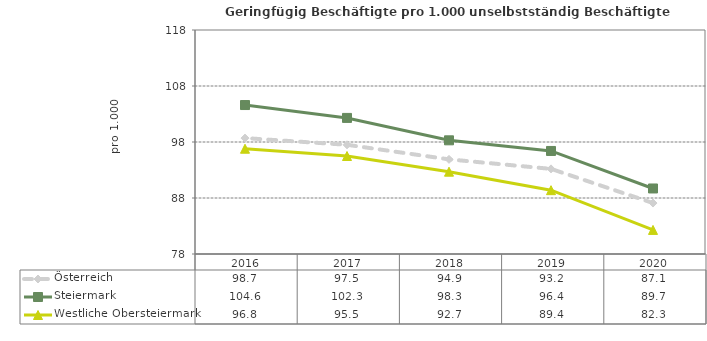
| Category | Österreich | Steiermark | Westliche Obersteiermark |
|---|---|---|---|
| 2020.0 | 87.1 | 89.7 | 82.3 |
| 2019.0 | 93.2 | 96.4 | 89.4 |
| 2018.0 | 94.9 | 98.3 | 92.7 |
| 2017.0 | 97.5 | 102.3 | 95.5 |
| 2016.0 | 98.7 | 104.6 | 96.8 |